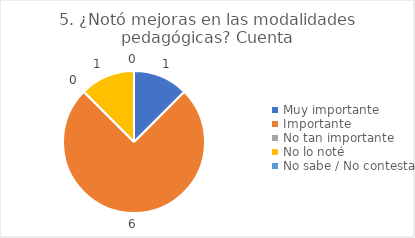
| Category | 5. ¿Notó mejoras en las modalidades pedagógicas? |
|---|---|
| Muy importante  | 0.125 |
| Importante  | 0.75 |
| No tan importante  | 0 |
| No lo noté  | 0.125 |
| No sabe / No contesta | 0 |